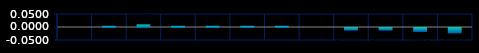
| Category | Series 0 |
|---|---|
| 0 | 0 |
| 1 | 0.005 |
| 2 | 0.01 |
| 3 | 0.005 |
| 4 | 0.005 |
| 5 | 0.005 |
| 6 | 0.005 |
| 7 | 0 |
| 8 | -0.01 |
| 9 | -0.01 |
| 10 | -0.015 |
| 11 | -0.02 |